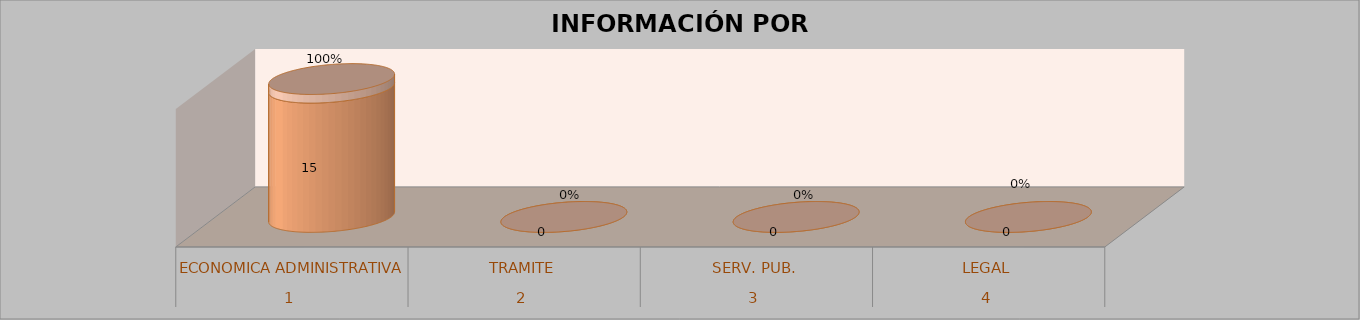
| Category | Series 0 | Series 1 | Series 2 | Series 3 |
|---|---|---|---|---|
| 0 |  |  | 15 | 1 |
| 1 |  |  | 0 | 0 |
| 2 |  |  | 0 | 0 |
| 3 |  |  | 0 | 0 |